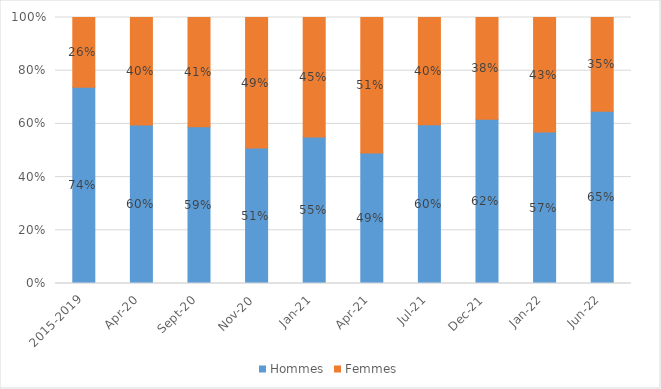
| Category | Hommes | Femmes |
|---|---|---|
| 2015-2019 | 0.738 | 0.262 |
| avr-20 | 0.596 | 0.404 |
| sept-20 | 0.589 | 0.411 |
| nov-20 | 0.509 | 0.491 |
| janv-21 | 0.551 | 0.449 |
| avr-21 | 0.49 | 0.51 |
| juil-21 | 0.596 | 0.404 |
| déc-21 | 0.618 | 0.382 |
| janv-22 | 0.57 | 0.43 |
| juin-22 | 0.647 | 0.353 |